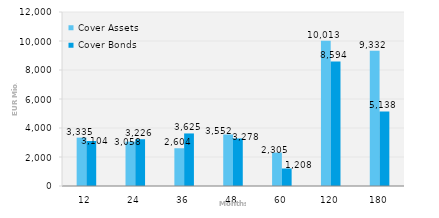
| Category | Cover Assets | Cover Bonds |
|---|---|---|
| 12.0 | 3334.9 | 3104.3 |
| 24.0 | 3058.3 | 3225.6 |
| 36.0 | 2603.6 | 3624.5 |
| 48.0 | 3551.7 | 3278.4 |
| 60.0 | 2304.7 | 1207.5 |
| 120.0 | 10012.7 | 8594.1 |
| 180.0 | 9331.5 | 5138 |